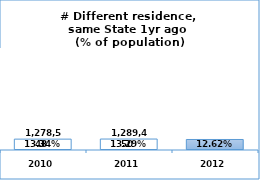
| Category | Chosen | Unchosen | Blank |
|---|---|---|---|
| 2010.0 | 0 | 1278548 | 8308689 |
| 2011.0 | 0 | 1289450 | 8410409 |
| 2012.0 | 1236302 | 0 | 8560245 |